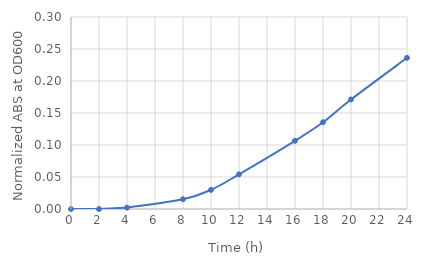
| Category | Series 0 |
|---|---|
| 0.0 | 0 |
| 2.0 | 0 |
| 4.0 | 0.002 |
| 8.0 | 0.015 |
| 10.0 | 0.03 |
| 12.0 | 0.054 |
| 16.0 | 0.107 |
| 18.0 | 0.136 |
| 20.0 | 0.171 |
| 24.0 | 0.236 |